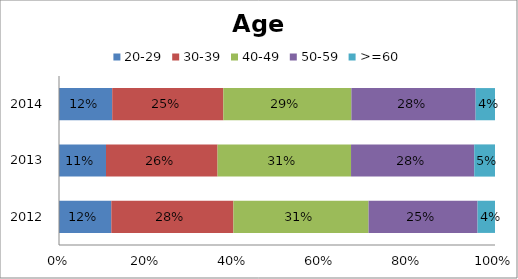
| Category | 20-29 | 30-39 | 40-49 | 50-59 | >=60 |
|---|---|---|---|---|---|
| 2012.0 | 0.12 | 0.28 | 0.31 | 0.25 | 0.04 |
| 2013.0 | 0.108 | 0.256 | 0.306 | 0.283 | 0.048 |
| 2014.0 | 0.122 | 0.255 | 0.294 | 0.285 | 0.044 |